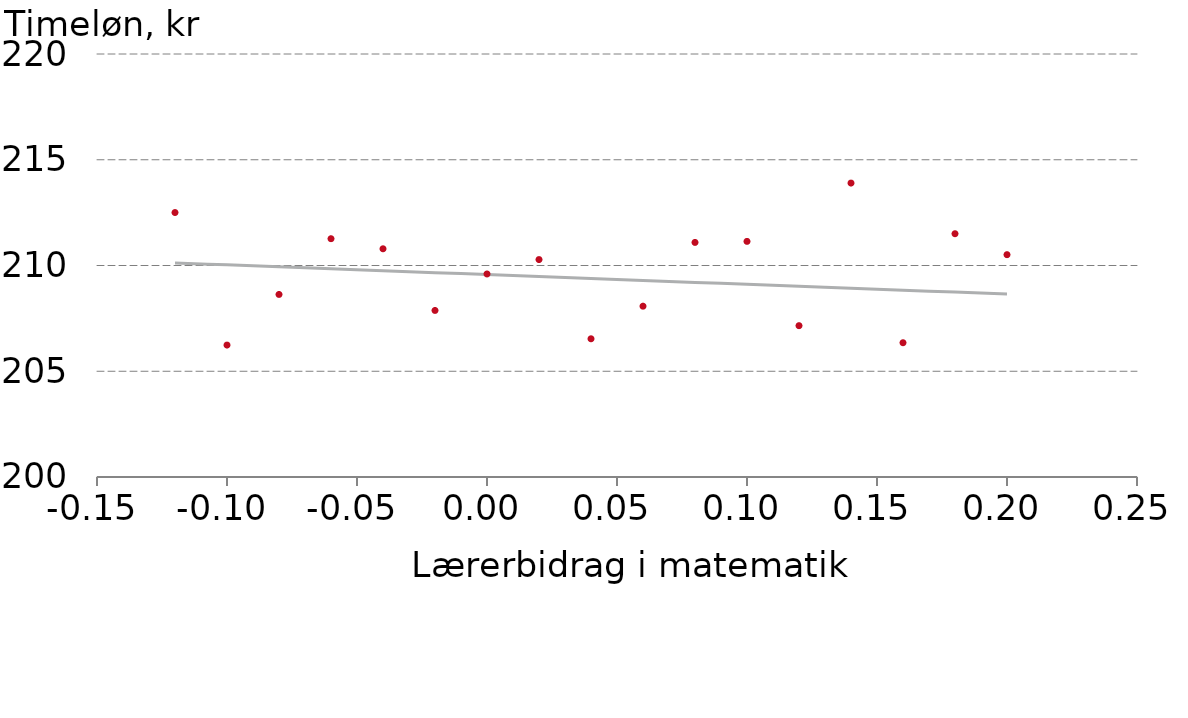
| Category |  Predicted timeløn |
|---|---|
| -0.12 | 210.122 |
| -0.1 | 210.03 |
| -0.08 | 209.938 |
| -0.06 | 209.846 |
| -0.04 | 209.754 |
| -0.02 | 209.662 |
| 0.0 | 209.57 |
| 0.02 | 209.478 |
| 0.04 | 209.386 |
| 0.06 | 209.294 |
| 0.08 | 209.202 |
| 0.1 | 209.11 |
| 0.12 | 209.018 |
| 0.14 | 208.926 |
| 0.16 | 208.834 |
| 0.18 | 208.742 |
| 0.2 | 208.65 |